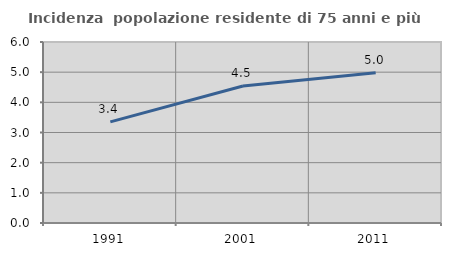
| Category | Incidenza  popolazione residente di 75 anni e più |
|---|---|
| 1991.0 | 3.354 |
| 2001.0 | 4.542 |
| 2011.0 | 4.977 |